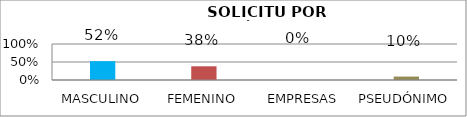
| Category | Series 1 |
|---|---|
| MASCULINO | 0.524 |
| FEMENINO | 0.381 |
| EMPRESAS | 0 |
| PSEUDÓNIMO | 0.095 |